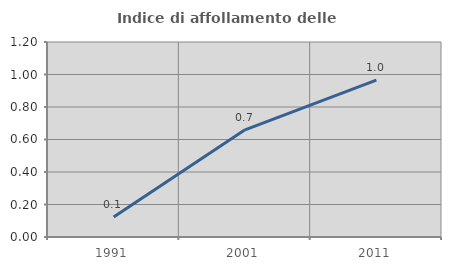
| Category | Indice di affollamento delle abitazioni  |
|---|---|
| 1991.0 | 0.122 |
| 2001.0 | 0.659 |
| 2011.0 | 0.966 |